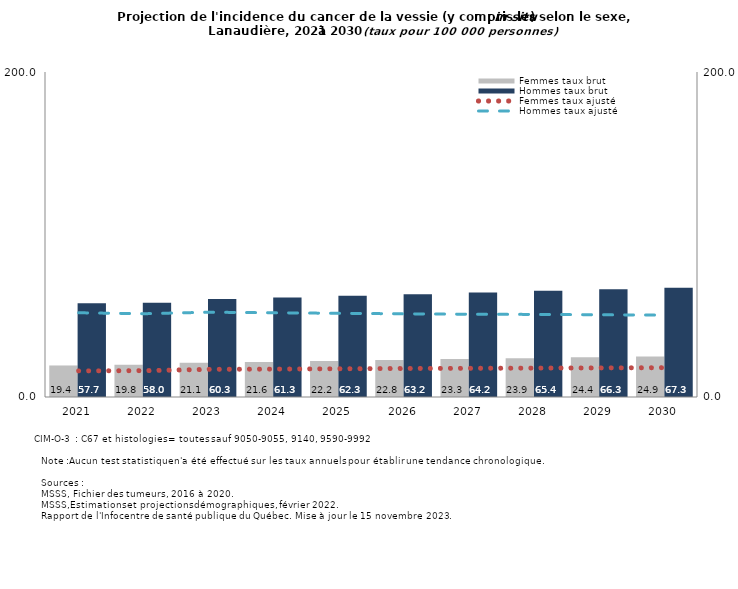
| Category | Femmes taux brut | Hommes taux brut |
|---|---|---|
| 2021.0 | 19.404 | 57.686 |
| 2022.0 | 19.841 | 57.999 |
| 2023.0 | 21.053 | 60.338 |
| 2024.0 | 21.587 | 61.287 |
| 2025.0 | 22.187 | 62.293 |
| 2026.0 | 22.818 | 63.247 |
| 2027.0 | 23.336 | 64.239 |
| 2028.0 | 23.897 | 65.374 |
| 2029.0 | 24.389 | 66.294 |
| 2030.0 | 24.914 | 67.26 |